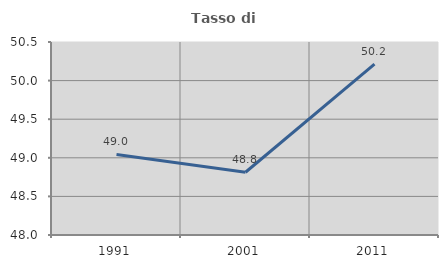
| Category | Tasso di occupazione   |
|---|---|
| 1991.0 | 49.043 |
| 2001.0 | 48.813 |
| 2011.0 | 50.213 |